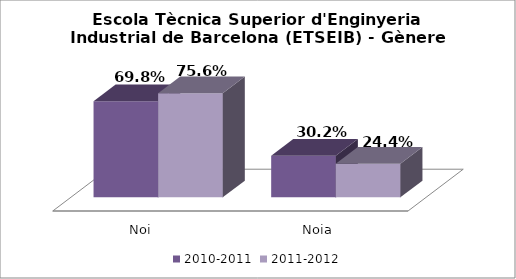
| Category | 2010-2011 | 2011-2012 |
|---|---|---|
| Noi | 0.698 | 0.756 |
| Noia | 0.302 | 0.244 |